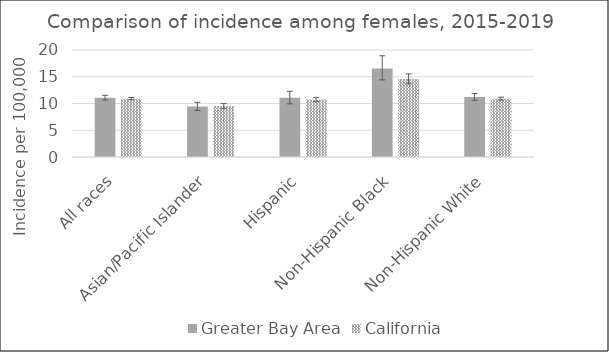
| Category | Greater Bay Area | California | SEER 18 |
|---|---|---|---|
| All races | 11.09 | 10.91 |  |
| Asian/Pacific Islander | 9.43 | 9.53 |  |
| Hispanic | 11.06 | 10.74 |  |
| Non-Hispanic Black | 16.55 | 14.58 |  |
| Non-Hispanic White | 11.22 | 10.91 |  |